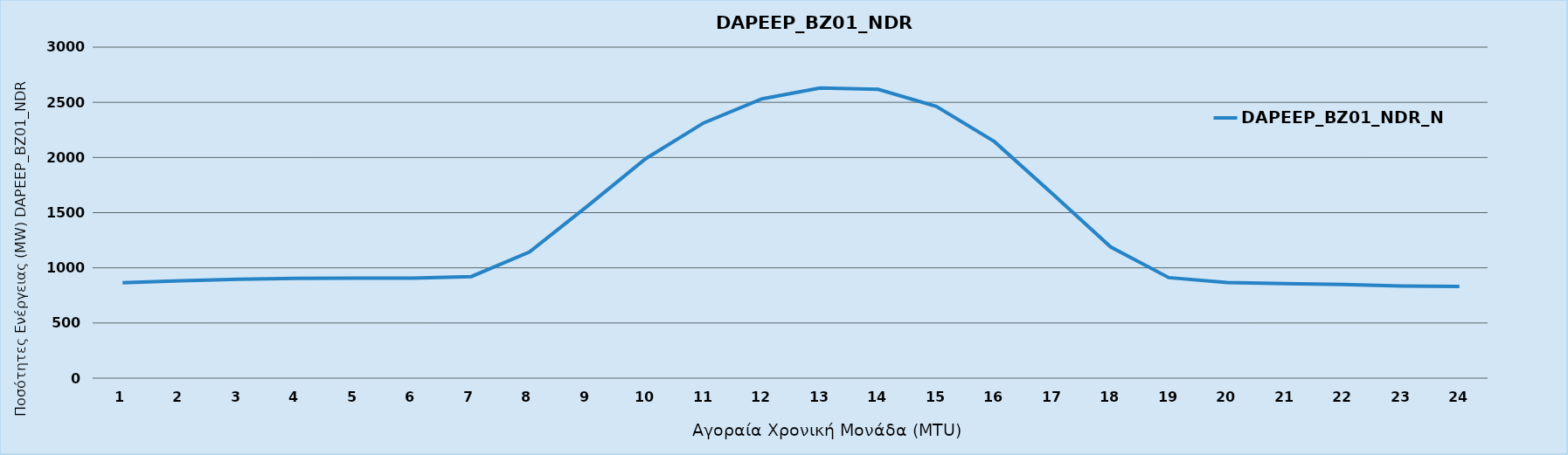
| Category | DAPEEP_BZ01_NDR_N1 |
|---|---|
| 0 | 864 |
| 1 | 883 |
| 2 | 897 |
| 3 | 904 |
| 4 | 907 |
| 5 | 907 |
| 6 | 921 |
| 7 | 1144 |
| 8 | 1560 |
| 9 | 1989 |
| 10 | 2314 |
| 11 | 2531 |
| 12 | 2630 |
| 13 | 2618 |
| 14 | 2463 |
| 15 | 2144 |
| 16 | 1671 |
| 17 | 1189 |
| 18 | 911 |
| 19 | 866 |
| 20 | 856 |
| 21 | 848 |
| 22 | 836 |
| 23 | 831 |